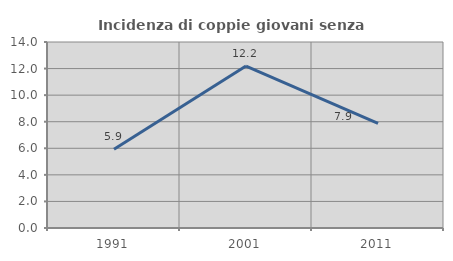
| Category | Incidenza di coppie giovani senza figli |
|---|---|
| 1991.0 | 5.926 |
| 2001.0 | 12.19 |
| 2011.0 | 7.874 |